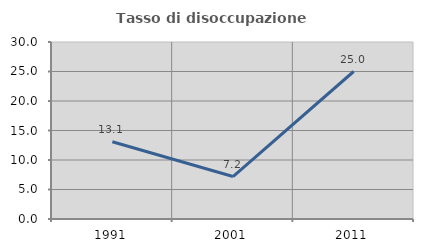
| Category | Tasso di disoccupazione giovanile  |
|---|---|
| 1991.0 | 13.084 |
| 2001.0 | 7.194 |
| 2011.0 | 25 |